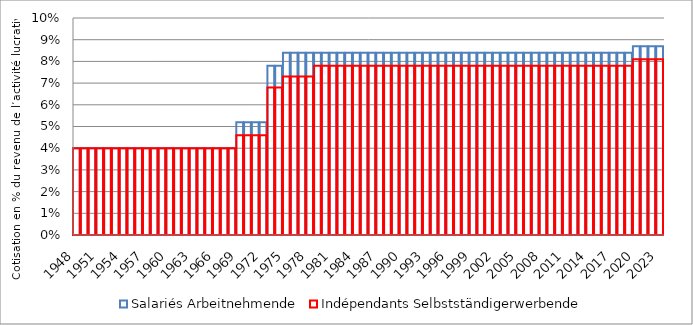
| Category | Salariés | Indépendants |
|---|---|---|
| 1948.0 | 0.04 | 0.04 |
| 1949.0 | 0.04 | 0.04 |
| 1950.0 | 0.04 | 0.04 |
| 1951.0 | 0.04 | 0.04 |
| 1952.0 | 0.04 | 0.04 |
| 1953.0 | 0.04 | 0.04 |
| 1954.0 | 0.04 | 0.04 |
| 1955.0 | 0.04 | 0.04 |
| 1956.0 | 0.04 | 0.04 |
| 1957.0 | 0.04 | 0.04 |
| 1958.0 | 0.04 | 0.04 |
| 1959.0 | 0.04 | 0.04 |
| 1960.0 | 0.04 | 0.04 |
| 1961.0 | 0.04 | 0.04 |
| 1962.0 | 0.04 | 0.04 |
| 1963.0 | 0.04 | 0.04 |
| 1964.0 | 0.04 | 0.04 |
| 1965.0 | 0.04 | 0.04 |
| 1966.0 | 0.04 | 0.04 |
| 1967.0 | 0.04 | 0.04 |
| 1968.0 | 0.04 | 0.04 |
| 1969.0 | 0.052 | 0.046 |
| 1970.0 | 0.052 | 0.046 |
| 1971.0 | 0.052 | 0.046 |
| 1972.0 | 0.052 | 0.046 |
| 1973.0 | 0.078 | 0.068 |
| 1974.0 | 0.078 | 0.068 |
| 1975.0 | 0.084 | 0.073 |
| 1976.0 | 0.084 | 0.073 |
| 1977.0 | 0.084 | 0.073 |
| 1978.0 | 0.084 | 0.073 |
| 1979.0 | 0.084 | 0.078 |
| 1980.0 | 0.084 | 0.078 |
| 1981.0 | 0.084 | 0.078 |
| 1982.0 | 0.084 | 0.078 |
| 1983.0 | 0.084 | 0.078 |
| 1984.0 | 0.084 | 0.078 |
| 1985.0 | 0.084 | 0.078 |
| 1986.0 | 0.084 | 0.078 |
| 1987.0 | 0.084 | 0.078 |
| 1988.0 | 0.084 | 0.078 |
| 1989.0 | 0.084 | 0.078 |
| 1990.0 | 0.084 | 0.078 |
| 1991.0 | 0.084 | 0.078 |
| 1992.0 | 0.084 | 0.078 |
| 1993.0 | 0.084 | 0.078 |
| 1994.0 | 0.084 | 0.078 |
| 1995.0 | 0.084 | 0.078 |
| 1996.0 | 0.084 | 0.078 |
| 1997.0 | 0.084 | 0.078 |
| 1998.0 | 0.084 | 0.078 |
| 1999.0 | 0.084 | 0.078 |
| 2000.0 | 0.084 | 0.078 |
| 2001.0 | 0.084 | 0.078 |
| 2002.0 | 0.084 | 0.078 |
| 2003.0 | 0.084 | 0.078 |
| 2004.0 | 0.084 | 0.078 |
| 2005.0 | 0.084 | 0.078 |
| 2006.0 | 0.084 | 0.078 |
| 2007.0 | 0.084 | 0.078 |
| 2008.0 | 0.084 | 0.078 |
| 2009.0 | 0.084 | 0.078 |
| 2010.0 | 0.084 | 0.078 |
| 2011.0 | 0.084 | 0.078 |
| 2012.0 | 0.084 | 0.078 |
| 2013.0 | 0.084 | 0.078 |
| 2014.0 | 0.084 | 0.078 |
| 2015.0 | 0.084 | 0.078 |
| 2016.0 | 0.084 | 0.078 |
| 2017.0 | 0.084 | 0.078 |
| 2018.0 | 0.084 | 0.078 |
| 2019.0 | 0.084 | 0.078 |
| 2020.0 | 0.087 | 0.081 |
| 2021.0 | 0.087 | 0.081 |
| 2022.0 | 0.087 | 0.081 |
| 2023.0 | 0.087 | 0.081 |